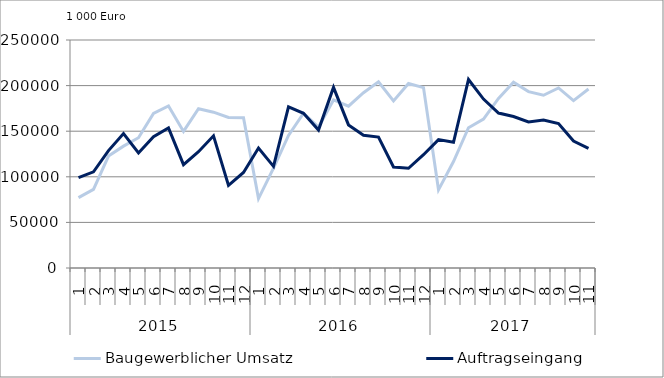
| Category | Baugewerblicher Umsatz | Auftragseingang |
|---|---|---|
| 0 | 77137.228 | 99023.008 |
| 1 | 86257.027 | 105491.844 |
| 2 | 122760.234 | 128704.324 |
| 3 | 133614.814 | 147438.665 |
| 4 | 142869.83 | 126182.175 |
| 5 | 169564.381 | 143879.815 |
| 6 | 177708.819 | 153660.001 |
| 7 | 149762.789 | 113338.261 |
| 8 | 174633.481 | 127520.775 |
| 9 | 170827.145 | 144931.886 |
| 10 | 165122.384 | 90621.16 |
| 11 | 164674.971 | 104795.622 |
| 12 | 76043.538 | 131571.482 |
| 13 | 109483.268 | 111467.248 |
| 14 | 145343.559 | 176673.268 |
| 15 | 169660.551 | 169566.96 |
| 16 | 154554.865 | 151228.165 |
| 17 | 184236.137 | 198035.655 |
| 18 | 177444.278 | 156900.898 |
| 19 | 192230.472 | 145537.167 |
| 20 | 204178.065 | 143616.217 |
| 21 | 183173.849 | 110770.94 |
| 22 | 202302.279 | 109384.188 |
| 23 | 197832.096 | 124193.91 |
| 24 | 85701.947 | 140751.008 |
| 25 | 116743.276 | 137863.383 |
| 26 | 153810.055 | 206710.579 |
| 27 | 163342.989 | 185183.797 |
| 28 | 185946.221 | 169878.51 |
| 29 | 203627.91 | 166148.392 |
| 30 | 193377.256 | 160134.206 |
| 31 | 189429.952 | 162221.206 |
| 32 | 197405.279 | 158305.285 |
| 33 | 183450.026 | 139156.761 |
| 34 | 196209.214 | 131165.419 |